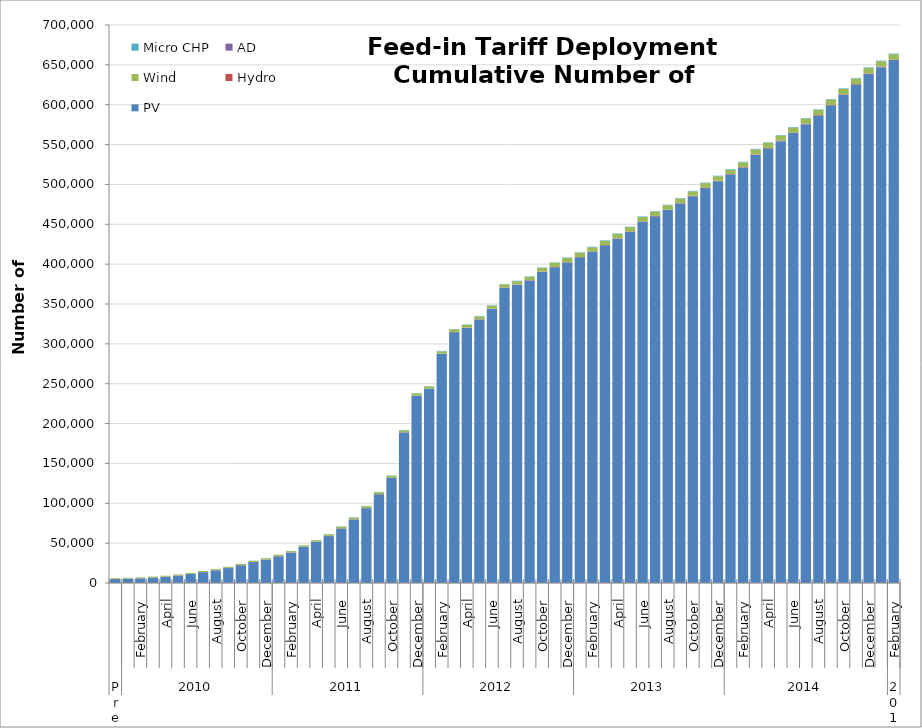
| Category | PV | Hydro | Wind | AD | Micro CHP |
|---|---|---|---|---|---|
| 0 | 4840 | 153 | 969 | 2 | 0 |
| 1 | 5374 | 154 | 992 | 2 | 0 |
| 2 | 5847 | 167 | 1027 | 2 | 0 |
| 3 | 6782 | 190 | 1082 | 3 | 0 |
| 4 | 7832 | 191 | 1119 | 3 | 0 |
| 5 | 9351 | 191 | 1169 | 3 | 0 |
| 6 | 11264 | 192 | 1222 | 4 | 6 |
| 7 | 13582 | 195 | 1279 | 5 | 16 |
| 8 | 15860 | 196 | 1333 | 6 | 25 |
| 9 | 18723 | 200 | 1390 | 6 | 38 |
| 10 | 22199 | 209 | 1472 | 6 | 56 |
| 11 | 26208 | 213 | 1551 | 6 | 92 |
| 12 | 29290 | 214 | 1594 | 6 | 125 |
| 13 | 33437 | 221 | 1649 | 7 | 152 |
| 14 | 38116 | 222 | 1706 | 7 | 196 |
| 15 | 45183 | 226 | 1797 | 9 | 241 |
| 16 | 51518 | 235 | 1868 | 10 | 266 |
| 17 | 58846 | 248 | 1957 | 12 | 293 |
| 18 | 68377 | 253 | 2160 | 13 | 312 |
| 19 | 79638 | 257 | 2222 | 13 | 332 |
| 20 | 93795 | 264 | 2290 | 15 | 357 |
| 21 | 111226 | 278 | 2384 | 15 | 399 |
| 22 | 131698 | 286 | 2458 | 16 | 428 |
| 23 | 188725 | 295 | 2535 | 17 | 444 |
| 24 | 234933 | 303 | 2614 | 20 | 456 |
| 25 | 243401 | 312 | 2745 | 22 | 461 |
| 26 | 287416 | 331 | 2901 | 22 | 466 |
| 27 | 314491 | 347 | 3338 | 22 | 476 |
| 28 | 320013 | 355 | 3410 | 24 | 484 |
| 29 | 330538 | 367 | 3524 | 28 | 496 |
| 30 | 343804 | 380 | 3667 | 31 | 513 |
| 31 | 370368 | 390 | 3793 | 36 | 519 |
| 32 | 374284 | 390 | 3956 | 37 | 522 |
| 33 | 379549 | 401 | 4160 | 41 | 532 |
| 34 | 390269 | 410 | 4392 | 44 | 547 |
| 35 | 396049 | 422 | 5130 | 45 | 561 |
| 36 | 402109 | 438 | 5148 | 48 | 569 |
| 37 | 408551 | 439 | 5183 | 50 | 580 |
| 38 | 415498 | 447 | 5248 | 52 | 584 |
| 39 | 423584 | 452 | 5292 | 53 | 587 |
| 40 | 432007 | 459 | 5315 | 55 | 592 |
| 41 | 440553 | 470 | 5354 | 55 | 592 |
| 42 | 453268 | 473 | 5393 | 60 | 593 |
| 43 | 460026 | 476 | 5428 | 63 | 594 |
| 44 | 467879 | 480 | 5462 | 67 | 594 |
| 45 | 476231 | 490 | 5533 | 70 | 594 |
| 46 | 485211 | 498 | 5589 | 73 | 596 |
| 47 | 495453 | 518 | 5656 | 78 | 600 |
| 48 | 504058 | 528 | 5721 | 84 | 603 |
| 49 | 512309 | 535 | 5771 | 85 | 608 |
| 50 | 521319 | 543 | 5851 | 89 | 610 |
| 51 | 537054 | 554 | 6296 | 96 | 615 |
| 52 | 545263 | 556 | 6316 | 97 | 615 |
| 53 | 554292 | 564 | 6346 | 99 | 615 |
| 54 | 564369 | 568 | 6382 | 103 | 615 |
| 55 | 575586 | 573 | 6411 | 104 | 617 |
| 56 | 586324 | 578 | 6446 | 113 | 619 |
| 57 | 599218 | 585 | 6544 | 120 | 621 |
| 58 | 612613 | 593 | 6587 | 125 | 625 |
| 59 | 625338 | 598 | 6640 | 141 | 628 |
| 60 | 638670 | 602 | 6727 | 156 | 629 |
| 61 | 647143 | 604 | 6727 | 156 | 635 |
| 62 | 655993 | 604 | 6733 | 156 | 640 |